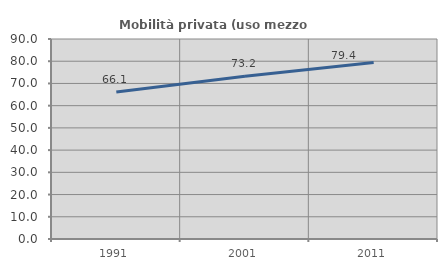
| Category | Mobilità privata (uso mezzo privato) |
|---|---|
| 1991.0 | 66.131 |
| 2001.0 | 73.192 |
| 2011.0 | 79.4 |